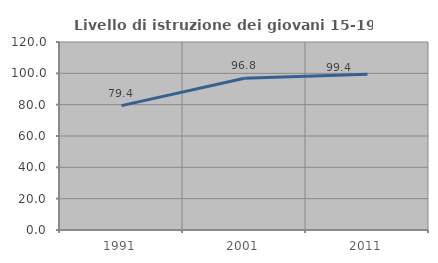
| Category | Livello di istruzione dei giovani 15-19 anni |
|---|---|
| 1991.0 | 79.386 |
| 2001.0 | 96.842 |
| 2011.0 | 99.379 |